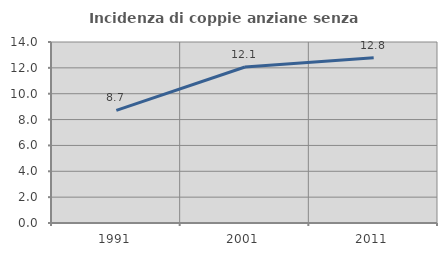
| Category | Incidenza di coppie anziane senza figli  |
|---|---|
| 1991.0 | 8.715 |
| 2001.0 | 12.069 |
| 2011.0 | 12.774 |